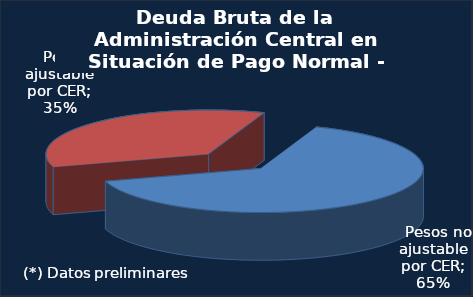
| Category | Series 0 |
|---|---|
|   Pesos no ajustable por CER | 39684.3 |
|   Pesos ajustable por CER | 21606.8 |